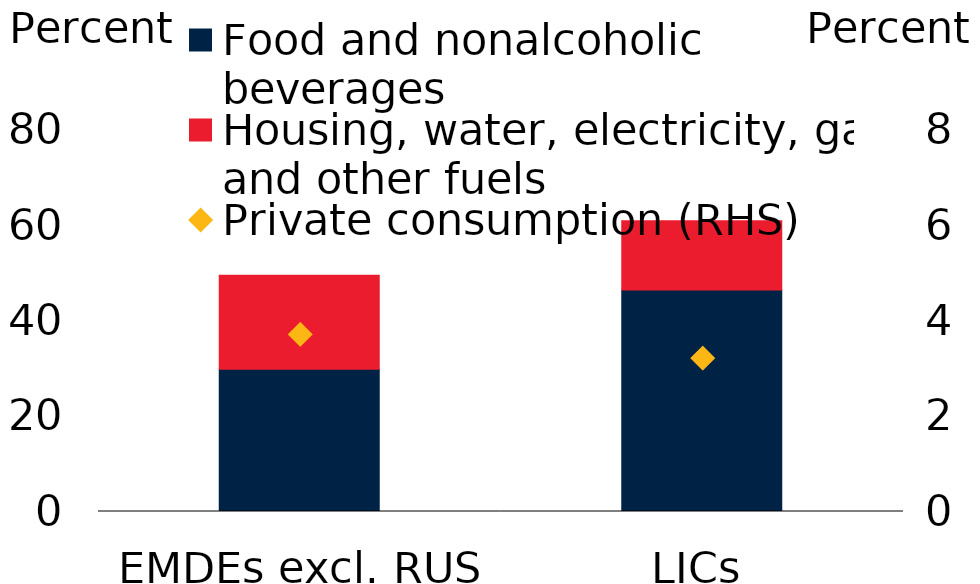
| Category | Food and nonalcoholic beverages | Housing, water, electricity, gas and other fuels |
|---|---|---|
| EMDEs excl. RUS and UKR | 29.8 | 19.7 |
| LICs | 46.4 | 14.5 |